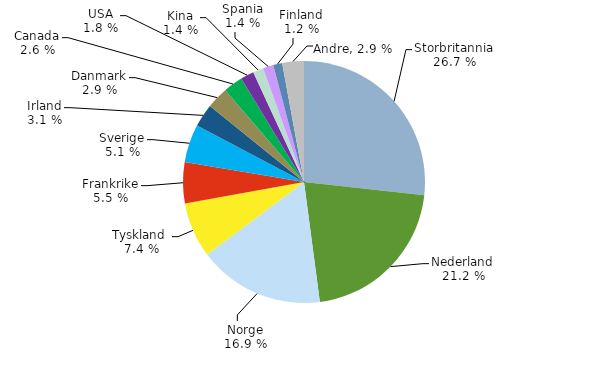
| Category | Series 0 |
|---|---|
| Storbritannia | 0.268 |
| Nederland | 0.212 |
| Norge | 0.169 |
| Tyskland  | 0.074 |
| Frankrike | 0.055 |
| Sverige | 0.051 |
| Irland | 0.031 |
| Danmark | 0.029 |
| Canada | 0.026 |
| USA | 0.018 |
| Kina | 0.014 |
| Spania | 0.014 |
| Finland | 0.012 |
| Andre | 0.029 |